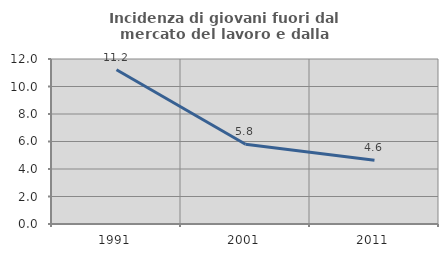
| Category | Incidenza di giovani fuori dal mercato del lavoro e dalla formazione  |
|---|---|
| 1991.0 | 11.214 |
| 2001.0 | 5.801 |
| 2011.0 | 4.634 |